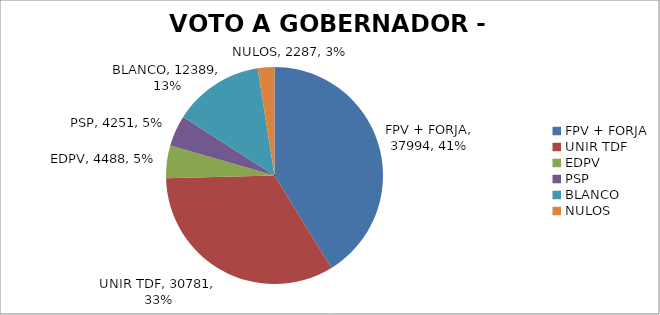
| Category | PROVINCIA |
|---|---|
| FPV + FORJA | 37994 |
| UNIR TDF | 30781 |
| EDPV | 4488 |
| PSP | 4251 |
| BLANCO | 12389 |
| NULOS | 2287 |